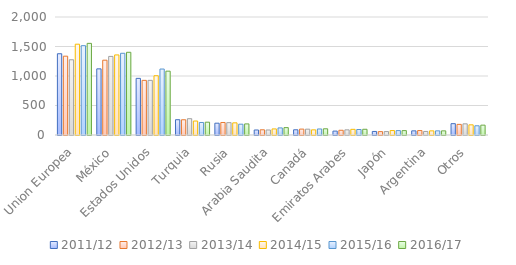
| Category | 2011/12 | 2012/13 | 2013/14 | 2014/15 | 2015/16 | 2016/17 |
|---|---|---|---|---|---|---|
| Union Europea | 1377 | 1336 | 1275 | 1539 | 1514 | 1553 |
| México | 1121 | 1268 | 1332 | 1357 | 1385 | 1402 |
| Estados Unidos | 960 | 926 | 926.276 | 1004 | 1118 | 1082 |
| Turquia | 259 | 258 | 276 | 237 | 212 | 217 |
| Rusia | 200 | 212 | 209 | 206 | 183 | 188 |
| Arabia Saudita | 85 | 88 | 85 | 103 | 120 | 125 |
| Canadá | 88 | 100 | 99 | 87 | 102 | 105 |
| Emiratos Arabes | 66 | 80 | 87 | 96 | 93 | 97 |
| Japón | 60 | 57 | 58 | 75 | 74 | 74 |
| Argentina | 70 | 75 | 60 | 70 | 70 | 70 |
| Otros | 192 | 180 | 189 | 172 | 156 | 167 |